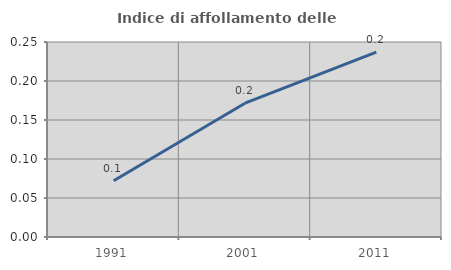
| Category | Indice di affollamento delle abitazioni  |
|---|---|
| 1991.0 | 0.072 |
| 2001.0 | 0.172 |
| 2011.0 | 0.237 |